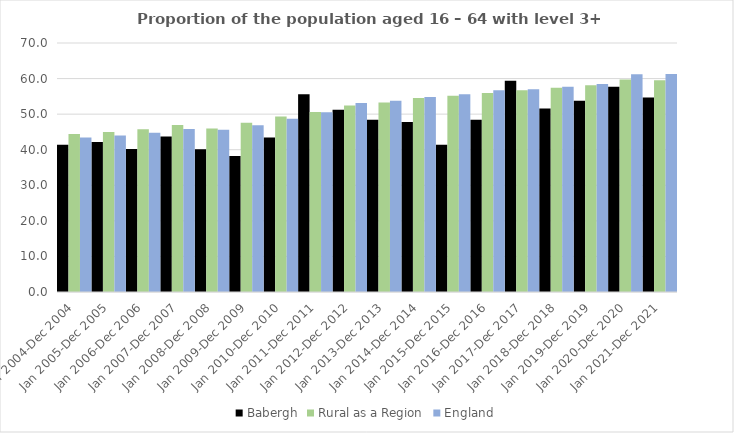
| Category | Babergh | Rural as a Region | England |
|---|---|---|---|
| Jan 2004-Dec 2004 | 41.4 | 44.405 | 43.4 |
| Jan 2005-Dec 2005 | 42.2 | 44.973 | 44 |
| Jan 2006-Dec 2006 | 40.2 | 45.774 | 44.8 |
| Jan 2007-Dec 2007 | 43.7 | 46.968 | 45.8 |
| Jan 2008-Dec 2008 | 40.1 | 45.964 | 45.6 |
| Jan 2009-Dec 2009 | 38.2 | 47.59 | 46.9 |
| Jan 2010-Dec 2010 | 43.4 | 49.362 | 48.7 |
| Jan 2011-Dec 2011 | 55.6 | 50.602 | 50.5 |
| Jan 2012-Dec 2012 | 51.2 | 52.439 | 53.1 |
| Jan 2013-Dec 2013 | 48.4 | 53.276 | 53.8 |
| Jan 2014-Dec 2014 | 47.8 | 54.57 | 54.8 |
| Jan 2015-Dec 2015 | 41.4 | 55.16 | 55.6 |
| Jan 2016-Dec 2016 | 48.4 | 55.941 | 56.7 |
| Jan 2017-Dec 2017 | 59.4 | 56.689 | 57 |
| Jan 2018-Dec 2018 | 51.6 | 57.389 | 57.7 |
| Jan 2019-Dec 2019 | 53.8 | 58.147 | 58.5 |
| Jan 2020-Dec 2020 | 57.7 | 59.771 | 61.2 |
| Jan 2021-Dec 2021 | 54.7 | 59.54 | 61.3 |